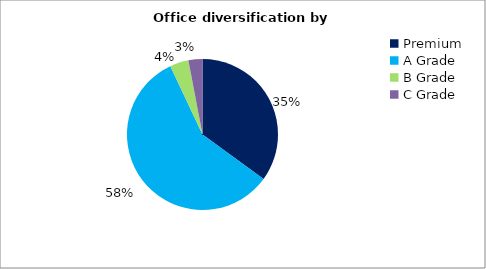
| Category | Series 0 |
|---|---|
| Premium | 0.35 |
| A Grade | 0.58 |
| B Grade | 0.04 |
| C Grade | 0.03 |